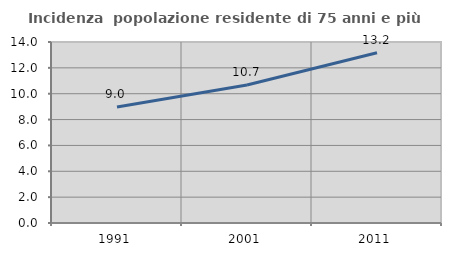
| Category | Incidenza  popolazione residente di 75 anni e più |
|---|---|
| 1991.0 | 8.976 |
| 2001.0 | 10.673 |
| 2011.0 | 13.169 |